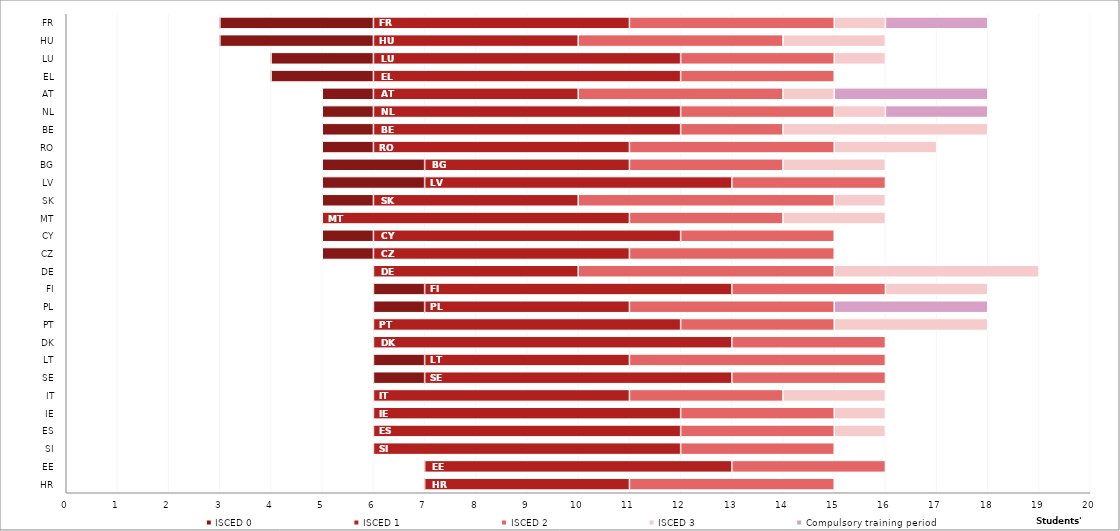
| Category | Starting age | ISCED 0 | ISCED 1 | ISCED 2 | ISCED 3 | Compulsory training period |
|---|---|---|---|---|---|---|
| HR | 7 | 0 | 4 | 4 | 0 | 0 |
| EE | 7 | 0 | 6 | 3 | 0 | 0 |
| SI | 6 | 0 | 6 | 3 | 0 | 0 |
| ES | 6 | 0 | 6 | 3 | 1 | 0 |
| IE | 6 | 0 | 6 | 3 | 1 | 0 |
| IT | 6 | 0 | 5 | 3 | 2 | 0 |
| SE | 6 | 1 | 6 | 3 | 0 | 0 |
| LT | 6 | 1 | 4 | 5 | 0 | 0 |
| DK | 6 | 0 | 7 | 3 | 0 | 0 |
| PT | 6 | 0 | 6 | 3 | 3 | 0 |
| PL | 6 | 1 | 4 | 4 | 0 | 3 |
| FI | 6 | 1 | 6 | 3 | 2 | 0 |
| DE | 6 | 0 | 4 | 5 | 4 | 0 |
| CZ | 5 | 1 | 5 | 4 | 0 | 0 |
| CY | 5 | 1 | 6 | 3 | 0 | 0 |
| MT | 5 | 0 | 6 | 3 | 2 | 0 |
| SK | 5 | 1 | 4 | 5 | 1 | 0 |
| LV | 5 | 2 | 6 | 3 | 0 | 0 |
| BG | 5 | 2 | 4 | 3 | 2 | 0 |
| RO | 5 | 1 | 5 | 4 | 2 | 0 |
| BE | 5 | 1 | 6 | 2 | 4 | 0 |
| NL | 5 | 1 | 6 | 3 | 1 | 2 |
| AT | 5 | 1 | 4 | 4 | 1 | 3 |
| EL | 4 | 2 | 6 | 3 | 0 | 0 |
| LU | 4 | 2 | 6 | 3 | 1 | 0 |
| HU | 3 | 3 | 4 | 4 | 2 | 0 |
| FR | 3 | 3 | 5 | 4 | 1 | 2 |